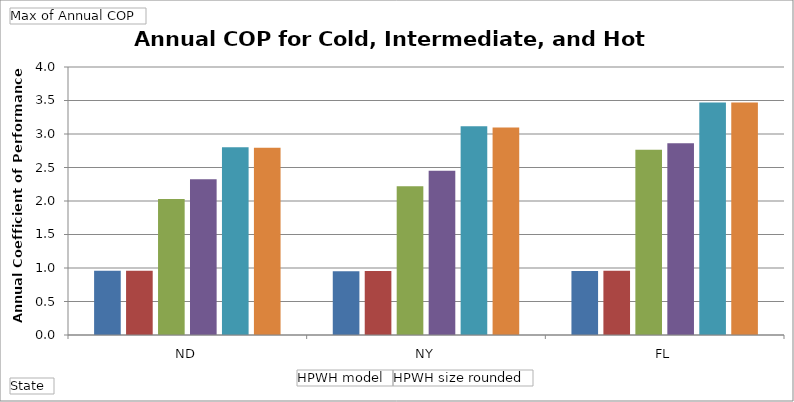
| Category | Electric resistance - 50 | Electric resistance - 80 | Hybrid heat pump - 50 | Hybrid heat pump - 80 | Pure heat pump - 40 | Pure heat pump - 80 |
|---|---|---|---|---|---|---|
| ND | 0.957 | 0.957 | 2.029 | 2.326 | 2.802 | 2.793 |
| NY | 0.953 | 0.954 | 2.219 | 2.453 | 3.115 | 3.096 |
| FL | 0.955 | 0.957 | 2.765 | 2.862 | 3.472 | 3.469 |